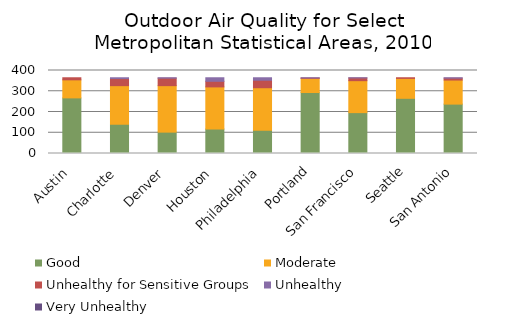
| Category | Good | Moderate | Unhealthy for Sensitive Groups | Unhealthy   | Very Unhealthy |
|---|---|---|---|---|---|
| Austin | 268 | 87 | 10 | 0 | 0 |
| Charlotte | 141 | 186 | 34 | 4 | 0 |
| Denver | 103 | 224 | 36 | 2 | 0 |
| Houston | 118 | 203 | 27 | 17 | 0 |
| Philadelphia | 112 | 205 | 36 | 12 | 0 |
| Portland | 294 | 68 | 2 | 1 | 0 |
| San Francisco | 197 | 154 | 13 | 1 | 0 |
| Seattle | 266 | 96 | 3 | 0 | 0 |
| San Antonio | 238 | 116 | 9 | 2 | 0 |